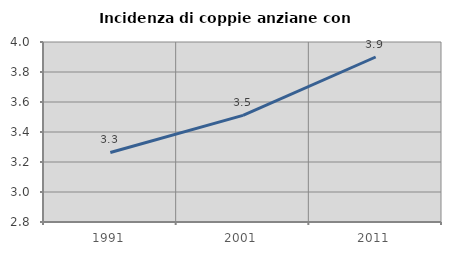
| Category | Incidenza di coppie anziane con figli |
|---|---|
| 1991.0 | 3.264 |
| 2001.0 | 3.511 |
| 2011.0 | 3.9 |